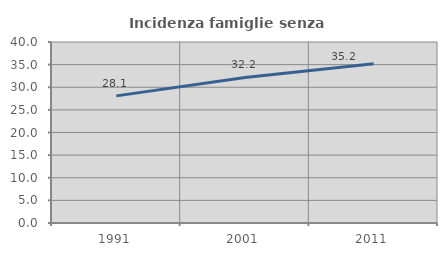
| Category | Incidenza famiglie senza nuclei |
|---|---|
| 1991.0 | 28.095 |
| 2001.0 | 32.165 |
| 2011.0 | 35.171 |